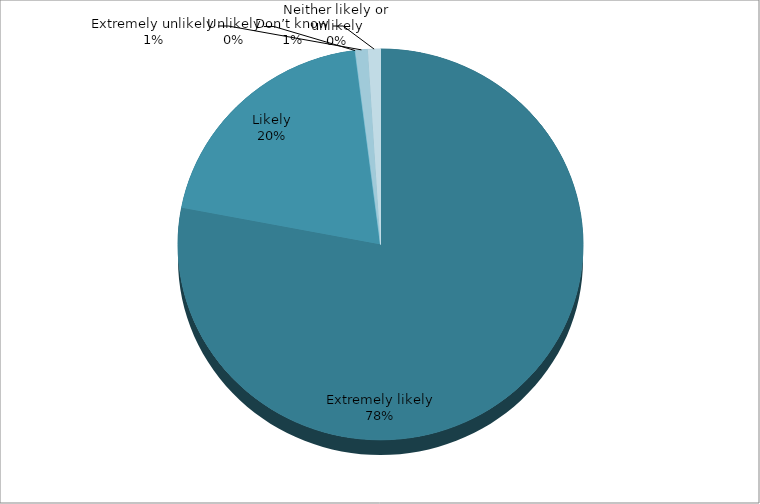
| Category | Series 0 |
|---|---|
| Extremely likely | 78 |
| Likely | 20 |
| Neither likely or unlikely | 0 |
| Unlikely | 0 |
| Extremely unlikely | 1 |
| Don’t know | 1 |